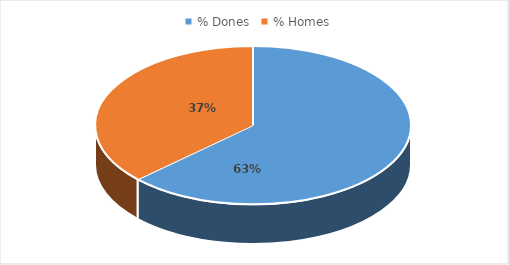
| Category | Series 0 |
|---|---|
| % Dones | 0.63 |
| % Homes | 0.37 |